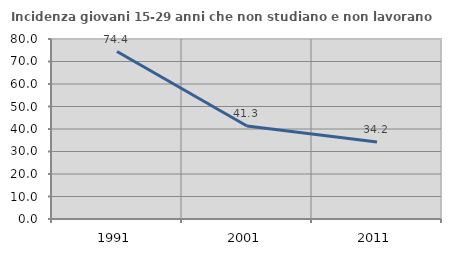
| Category | Incidenza giovani 15-29 anni che non studiano e non lavorano  |
|---|---|
| 1991.0 | 74.438 |
| 2001.0 | 41.308 |
| 2011.0 | 34.203 |